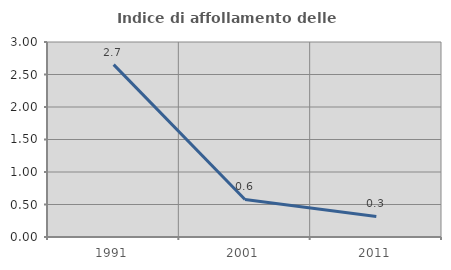
| Category | Indice di affollamento delle abitazioni  |
|---|---|
| 1991.0 | 2.652 |
| 2001.0 | 0.578 |
| 2011.0 | 0.317 |